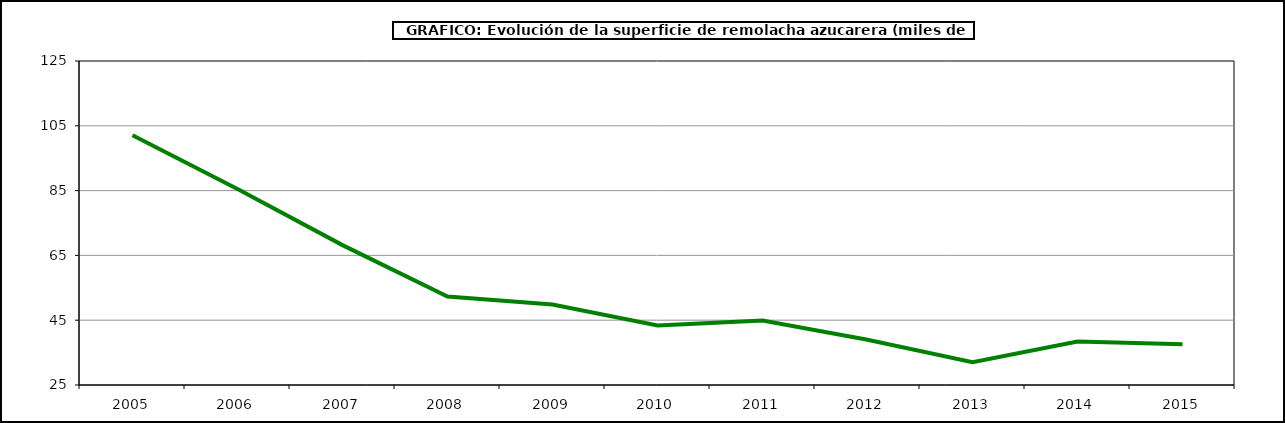
| Category | Superficie |
|---|---|
| 2005.0 | 102.104 |
| 2006.0 | 85.516 |
| 2007.0 | 68.171 |
| 2008.0 | 52.289 |
| 2009.0 | 49.813 |
| 2010.0 | 43.382 |
| 2011.0 | 44.931 |
| 2012.0 | 38.952 |
| 2013.0 | 32.052 |
| 2014.0 | 38.414 |
| 2015.0 | 37.605 |